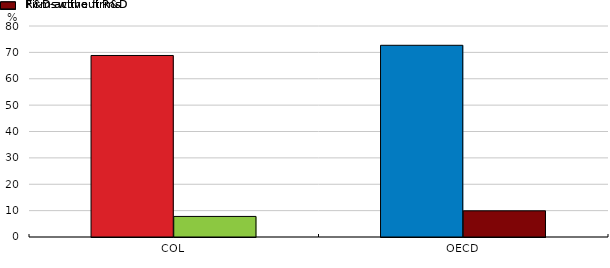
| Category | R&D-active firms | Firms without R&D |
|---|---|---|
| COL | 68.824 | 7.801 |
| OECD | 72.686 | 9.927 |